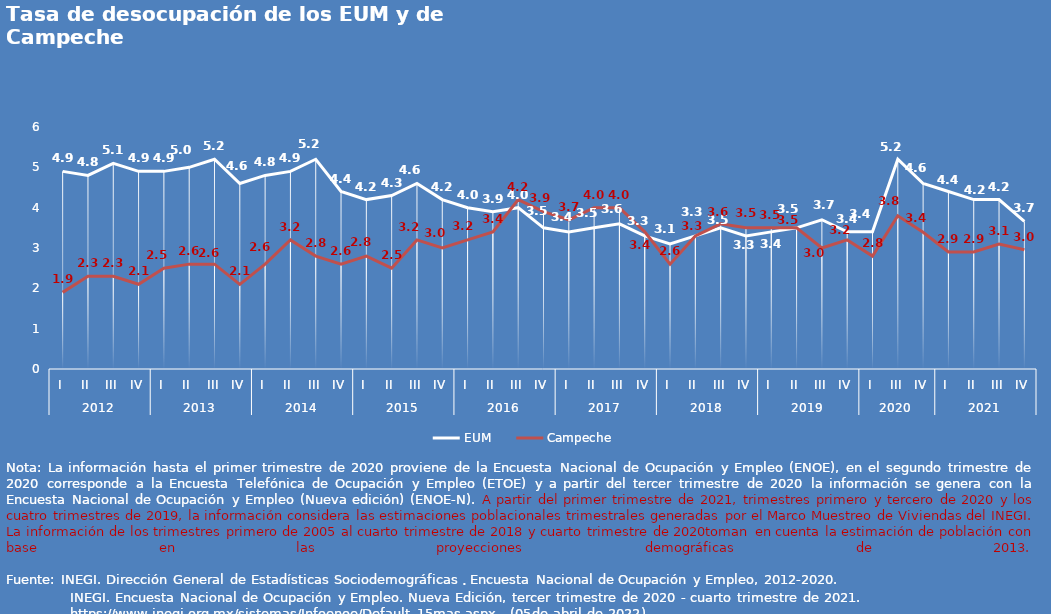
| Category | EUM | Campeche |
|---|---|---|
| 0 | 4.9 | 1.9 |
| 1 | 4.8 | 2.3 |
| 2 | 5.1 | 2.3 |
| 3 | 4.9 | 2.1 |
| 4 | 4.9 | 2.5 |
| 5 | 5 | 2.6 |
| 6 | 5.2 | 2.6 |
| 7 | 4.6 | 2.1 |
| 8 | 4.8 | 2.6 |
| 9 | 4.9 | 3.2 |
| 10 | 5.2 | 2.8 |
| 11 | 4.4 | 2.6 |
| 12 | 4.2 | 2.8 |
| 13 | 4.3 | 2.5 |
| 14 | 4.6 | 3.2 |
| 15 | 4.2 | 3 |
| 16 | 4 | 3.2 |
| 17 | 3.9 | 3.4 |
| 18 | 4 | 4.2 |
| 19 | 3.5 | 3.9 |
| 20 | 3.4 | 3.7 |
| 21 | 3.5 | 4 |
| 22 | 3.6 | 4 |
| 23 | 3.3 | 3.4 |
| 24 | 3.1 | 2.6 |
| 25 | 3.3 | 3.3 |
| 26 | 3.5 | 3.6 |
| 27 | 3.3 | 3.5 |
| 28 | 3.4 | 3.5 |
| 29 | 3.5 | 3.5 |
| 30 | 3.7 | 3 |
| 31 | 3.4 | 3.2 |
| 32 | 3.4 | 2.8 |
| 33 | 5.2 | 3.8 |
| 34 | 4.6 | 3.39 |
| 35 | 4.4 | 2.9 |
| 36 | 4.2 | 2.9 |
| 37 | 4.2 | 3.1 |
| 38 | 3.66 | 2.956 |